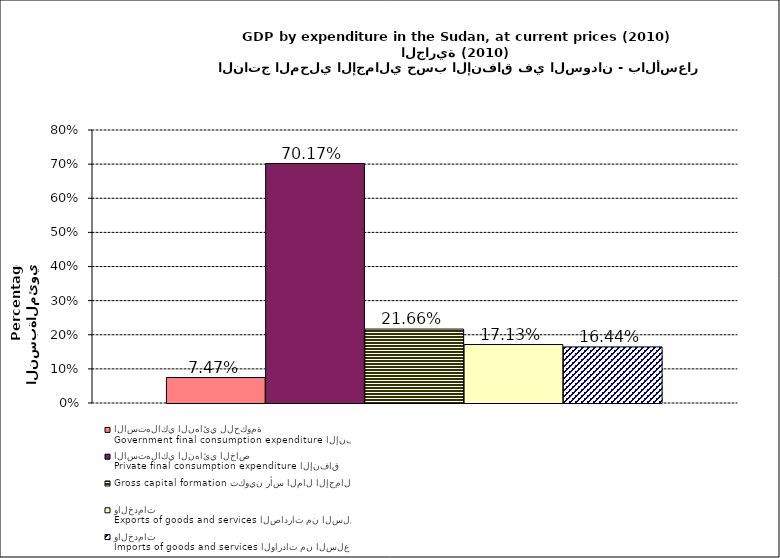
| Category | Government final consumption expenditure الإنفاق الاستهلاكي النهائي للحكومة | Private final consumption expenditure الإنفاق الاستهلاكي النهائي الخاص | Gross capital formation تكوين رأس المال الإجمالي | Exports of goods and services الصادرات من السلع والخدمات | Imports of goods and services الواردات من السلع والخدمات |
|---|---|---|---|---|---|
| 0 | 0.075 | 0.702 | 0.217 | 0.171 | 0.164 |